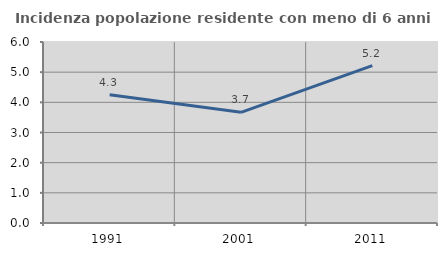
| Category | Incidenza popolazione residente con meno di 6 anni |
|---|---|
| 1991.0 | 4.251 |
| 2001.0 | 3.668 |
| 2011.0 | 5.214 |